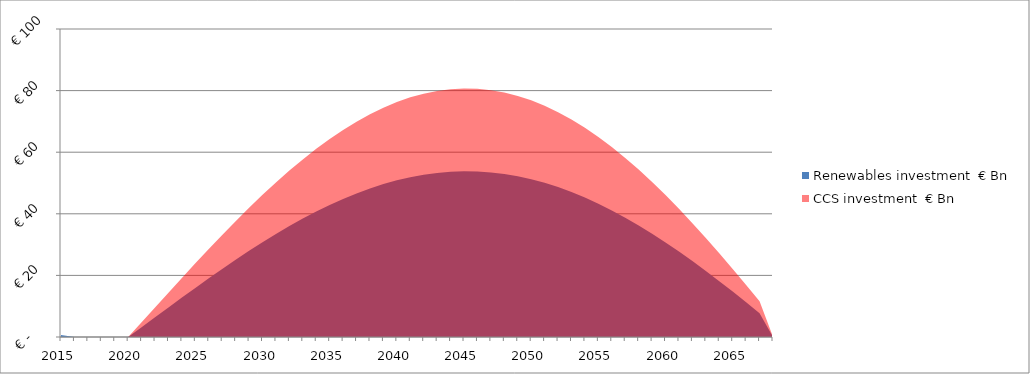
| Category | Renewables investment | CCS investment |
|---|---|---|
| 2015.0 | 0.624 | 0 |
| 2016.0 | 0 | 0 |
| 2017.0 | 0 | 0 |
| 2018.0 | 0 | 0 |
| 2019.0 | 0 | 0 |
| 2020.0 | 0 | 0 |
| 2021.0 | 3.194 | 4.792 |
| 2022.0 | 6.399 | 9.599 |
| 2023.0 | 9.601 | 14.401 |
| 2024.0 | 12.785 | 19.177 |
| 2025.0 | 15.938 | 23.907 |
| 2026.0 | 19.046 | 28.569 |
| 2027.0 | 22.096 | 33.144 |
| 2028.0 | 25.075 | 37.612 |
| 2029.0 | 27.969 | 41.953 |
| 2030.0 | 30.765 | 46.147 |
| 2031.0 | 33.451 | 50.176 |
| 2032.0 | 36.015 | 54.022 |
| 2033.0 | 38.445 | 57.668 |
| 2034.0 | 40.73 | 61.095 |
| 2035.0 | 42.86 | 64.29 |
| 2036.0 | 44.825 | 67.237 |
| 2037.0 | 46.615 | 69.922 |
| 2038.0 | 48.221 | 72.332 |
| 2039.0 | 49.637 | 74.456 |
| 2040.0 | 50.855 | 76.283 |
| 2041.0 | 51.869 | 77.804 |
| 2042.0 | 52.673 | 79.01 |
| 2043.0 | 53.264 | 79.895 |
| 2044.0 | 53.636 | 80.454 |
| 2045.0 | 53.789 | 80.683 |
| 2046.0 | 53.719 | 80.578 |
| 2047.0 | 53.427 | 80.14 |
| 2048.0 | 52.911 | 79.367 |
| 2049.0 | 52.175 | 78.262 |
| 2050.0 | 51.219 | 76.828 |
| 2051.0 | 50.047 | 75.07 |
| 2052.0 | 48.662 | 72.993 |
| 2053.0 | 47.07 | 70.604 |
| 2054.0 | 45.276 | 67.913 |
| 2055.0 | 43.287 | 64.93 |
| 2056.0 | 41.11 | 61.666 |
| 2057.0 | 38.755 | 58.133 |
| 2058.0 | 36.23 | 54.346 |
| 2059.0 | 33.546 | 50.319 |
| 2060.0 | 30.712 | 46.069 |
| 2061.0 | 27.742 | 41.613 |
| 2062.0 | 24.646 | 36.968 |
| 2063.0 | 21.437 | 32.155 |
| 2064.0 | 18.129 | 27.193 |
| 2065.0 | 14.735 | 22.103 |
| 2066.0 | 11.27 | 16.905 |
| 2067.0 | 7.748 | 11.622 |
| 2068.0 | 0 | 0 |